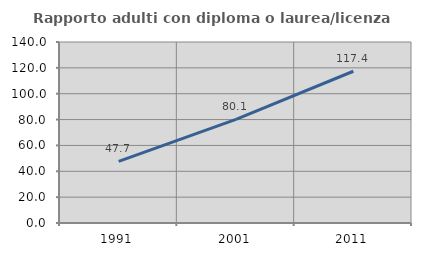
| Category | Rapporto adulti con diploma o laurea/licenza media  |
|---|---|
| 1991.0 | 47.697 |
| 2001.0 | 80.098 |
| 2011.0 | 117.368 |